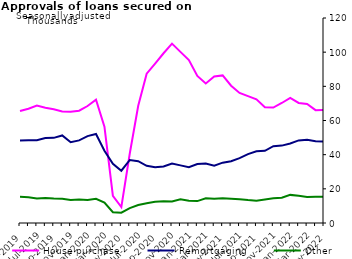
| Category | House purchase | Remortgaging | Other |
|---|---|---|---|
| May-2019 | 65513 | 48356 | 15323 |
| Jun-2019 | 66912 | 48416 | 15073 |
| Jul-2019 | 68742 | 48446 | 14329 |
| Aug-2019 | 67428 | 49687 | 14657 |
| Sep-2019 | 66603 | 49832 | 14316 |
| Oct-2019 | 65281 | 51252 | 14223 |
| Nov-2019 | 65127 | 47253 | 13449 |
| Dec-2019 | 65760 | 48358 | 13791 |
| Jan-2020 | 68479 | 50843 | 13510 |
| Feb-2020 | 72246 | 52128 | 14174 |
| Mar-2020 | 56426 | 42323 | 11924 |
| Apr-2020 | 15867 | 34638 | 6305 |
| May-2020 | 9339 | 30591 | 6042 |
| Jun-2020 | 40672 | 36891 | 8726 |
| Jul-2020 | 68633 | 36178 | 10500 |
| Aug-2020 | 87415 | 33447 | 11615 |
| Sep-2020 | 93323 | 32649 | 12404 |
| Oct-2020 | 99367 | 33125 | 12707 |
| Nov-2020 | 104984 | 34839 | 12616 |
| Dec-2020 | 100184 | 33735 | 13943 |
| Jan-2021 | 95401 | 32678 | 13016 |
| Feb-2021 | 86107 | 34480 | 12822 |
| Mar-2021 | 81647 | 34871 | 14443 |
| Apr-2021 | 85793 | 33596 | 14158 |
| May-2021 | 86388 | 35319 | 14482 |
| Jun-2021 | 80371 | 36174 | 14186 |
| Jul-2021 | 76138 | 37958 | 13876 |
| Aug-2021 | 74246 | 40305 | 13400 |
| Sep-2021 | 72368 | 42002 | 13090 |
| Oct-2021 | 67754 | 42223 | 13751 |
| Nov-2021 | 67603 | 44938 | 14428 |
| Dec-2021 | 70247 | 45304 | 14795 |
| Jan-2022 | 73264 | 46576 | 16458 |
| Feb-2022 | 70293 | 48337 | 15947 |
| Mar-2022 | 69642 | 48694 | 15247 |
| Apr-2022 | 66064 | 47824 | 15351 |
| May-2022 | 66163 | 47770 | 15297 |